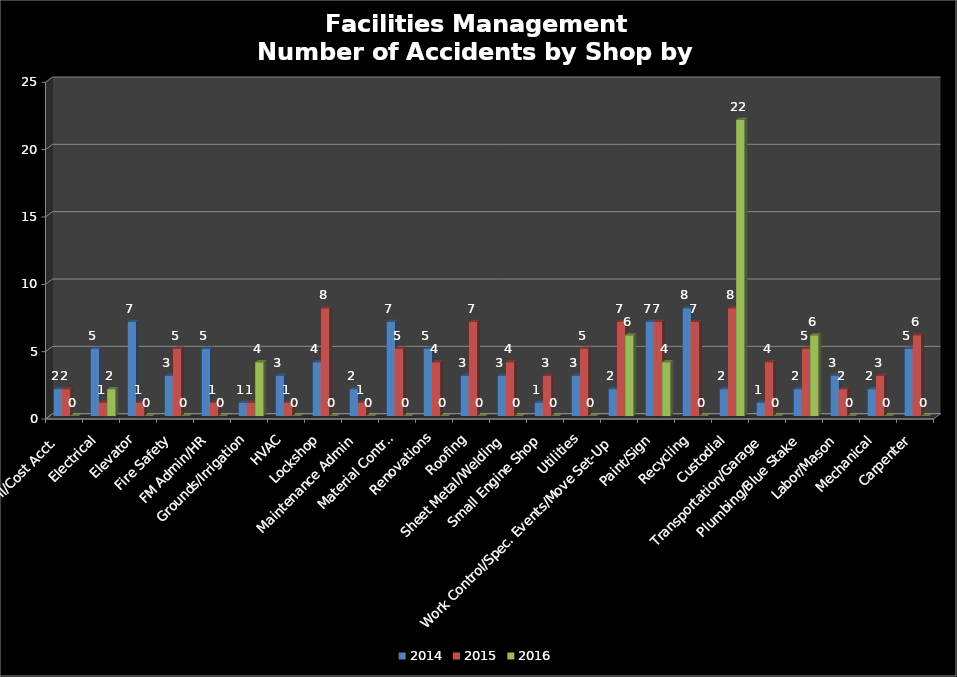
| Category | 2014 | 2015 | 2016 |
|---|---|---|---|
| Bus Serv/IT/Payroll/Cost Acct. | 2 | 2 | 0 |
| Electrical | 5 | 1 | 2 |
| Elevator | 7 | 1 | 0 |
| Fire Safety | 3 | 5 | 0 |
| FM Admin/HR | 5 | 1 | 0 |
| Grounds/Irrigation | 1 | 1 | 4 |
| HVAC | 3 | 1 | 0 |
| Lockshop | 4 | 8 | 0 |
| Maintenance Admin | 2 | 1 | 0 |
| Material Control | 7 | 5 | 0 |
| Renovations | 5 | 4 | 0 |
| Roofing | 3 | 7 | 0 |
| Sheet Metal/Welding | 3 | 4 | 0 |
| Small Engine Shop | 1 | 3 | 0 |
| Utilities | 3 | 5 | 0 |
| Work Control/Spec. Events/Move Set-Up | 2 | 7 | 6 |
| Paint/Sign | 7 | 7 | 4 |
| Recycling | 8 | 7 | 0 |
| Custodial | 2 | 8 | 22 |
| Transportation/Garage | 1 | 4 | 0 |
| Plumbing/Blue Stake | 2 | 5 | 6 |
| Labor/Mason | 3 | 2 | 0 |
| Mechanical | 2 | 3 | 0 |
| Carpenter | 5 | 6 | 0 |